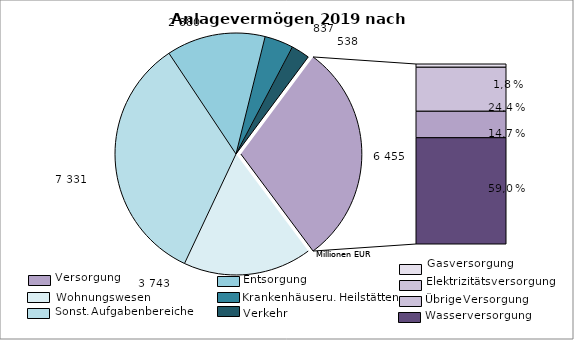
| Category | Series 0 |
|---|---|
| Wohnungsunternehmen | 3743 |
| sonstige Aufgabenbereiche | 7331 |
| Entsorgungsunternehmen | 2880 |
| Krankenhäuser | 837 |
| Verkehrsunternehmen | 538 |
| Gas | 117 |
| Elektrizität | 1578 |
| Kombinierte Unternehmen | 949 |
| Wasser | 3811 |